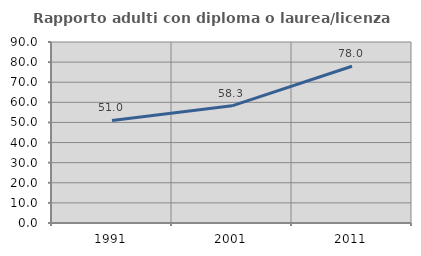
| Category | Rapporto adulti con diploma o laurea/licenza media  |
|---|---|
| 1991.0 | 51.02 |
| 2001.0 | 58.268 |
| 2011.0 | 77.966 |